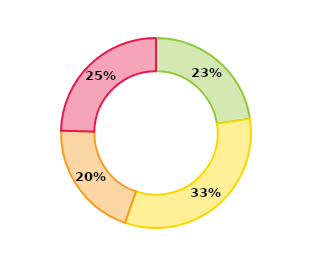
| Category | Vehicles |
|---|---|
| Low Risk | 45 |
| Mild Risk | 65 |
| Medium Risk | 40 |
| High Risk | 49 |